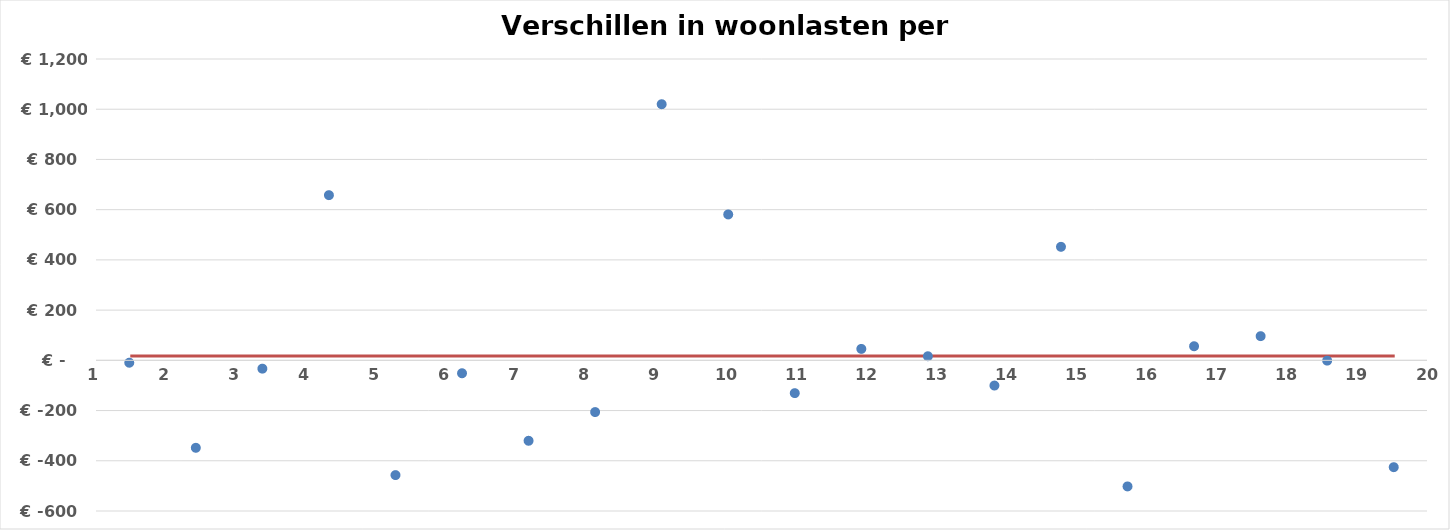
| Category | Series 1 |
|---|---|
| 0 | 16.96 |
| 1 | 16.96 |
| 2 | 16.96 |
| 3 | 16.96 |
| 4 | 16.96 |
| 5 | 16.96 |
| 6 | 16.96 |
| 7 | 16.96 |
| 8 | 16.96 |
| 9 | 16.96 |
| 10 | 16.96 |
| 11 | 16.96 |
| 12 | 16.96 |
| 13 | 16.96 |
| 14 | 16.96 |
| 15 | 16.96 |
| 16 | 16.96 |
| 17 | 16.96 |
| 18 | 16.96 |
| 19 | 16.96 |